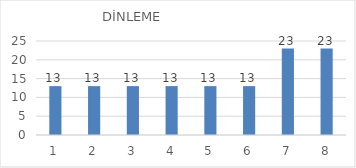
| Category | Series 0 |
|---|---|
| 0 | 13 |
| 1 | 13 |
| 2 | 13 |
| 3 | 13 |
| 4 | 13 |
| 5 | 13 |
| 6 | 23 |
| 7 | 23 |